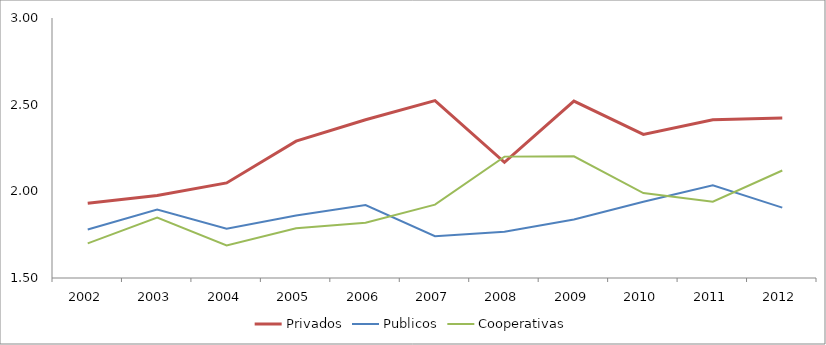
| Category | Privados | Publicos | Cooperativas |
|---|---|---|---|
| 2002.0 | 1.931 | 1.78 | 1.7 |
| 2003.0 | 1.976 | 1.896 | 1.848 |
| 2004.0 | 2.048 | 1.784 | 1.688 |
| 2005.0 | 2.29 | 1.86 | 1.787 |
| 2006.0 | 2.413 | 1.921 | 1.818 |
| 2007.0 | 2.523 | 1.741 | 1.923 |
| 2008.0 | 2.168 | 1.767 | 2.2 |
| 2009.0 | 2.521 | 1.837 | 2.202 |
| 2010.0 | 2.328 | 1.94 | 1.99 |
| 2011.0 | 2.413 | 2.035 | 1.941 |
| 2012.0 | 2.422 | 1.906 | 2.12 |